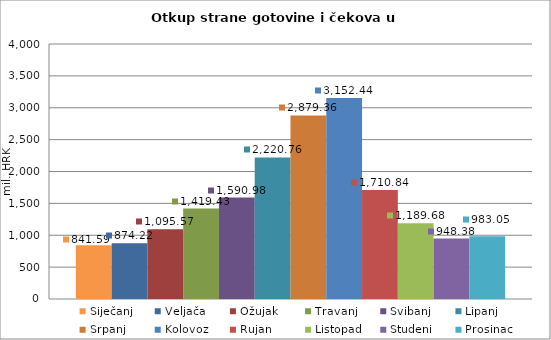
| Category | Siječanj | Veljača | Ožujak | Travanj | Svibanj | Lipanj | Srpanj | Kolovoz | Rujan | Listopad | Studeni | Prosinac |
|---|---|---|---|---|---|---|---|---|---|---|---|---|
| 0 | 841.588 | 874.22 | 1095.57 | 1419.43 | 1590.977 | 2220.761 | 2879.357 | 3152.444 | 1710.837 | 1189.684 | 948.384 | 983.045 |